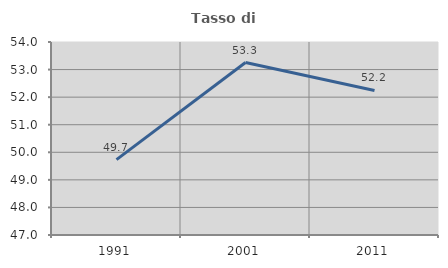
| Category | Tasso di occupazione   |
|---|---|
| 1991.0 | 49.734 |
| 2001.0 | 53.255 |
| 2011.0 | 52.244 |